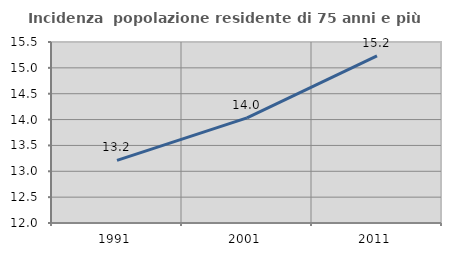
| Category | Incidenza  popolazione residente di 75 anni e più |
|---|---|
| 1991.0 | 13.211 |
| 2001.0 | 14.032 |
| 2011.0 | 15.23 |